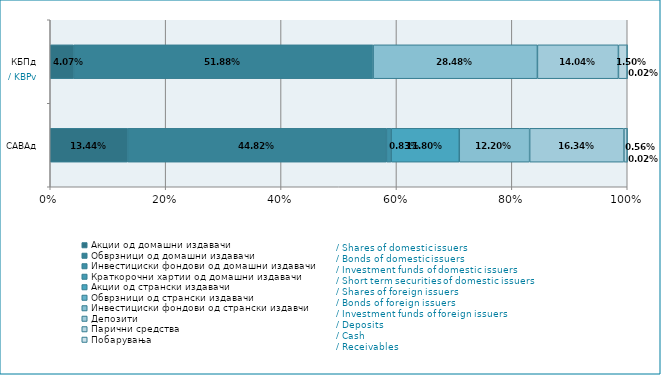
| Category | Акции од домашни издавачи  | Обврзници од домашни издавачи  | Инвестициски фондови од домашни издавачи   | Краткорочни хартии од домашни издавачи   | Акции од странски издавачи   | Обврзници од странски издавачи  | Инвестициски фондови од странски издавчи  | Депозити | Парични средства | Побарувања |
|---|---|---|---|---|---|---|---|---|---|---|
| САВАд | 0.134 | 0.448 | 0.008 | 0 | 0.118 | 0 | 0.122 | 0.163 | 0.006 | 0 |
| КБПд | 0.041 | 0.519 | 0 | 0 | 0 | 0 | 0.285 | 0.14 | 0.015 | 0 |